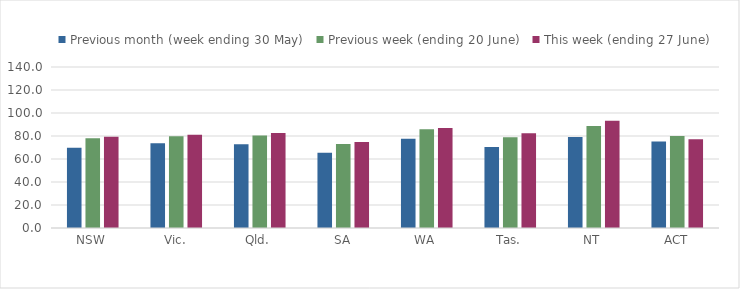
| Category | Previous month (week ending 30 May) | Previous week (ending 20 June) | This week (ending 27 June) |
|---|---|---|---|
| NSW | 69.873 | 77.946 | 79.283 |
| Vic. | 73.625 | 79.747 | 81.051 |
| Qld. | 72.76 | 80.413 | 82.523 |
| SA | 65.486 | 73.131 | 74.86 |
| WA | 77.51 | 85.819 | 87.059 |
| Tas. | 70.435 | 78.858 | 82.396 |
| NT | 79.21 | 88.617 | 93.172 |
| ACT | 75.195 | 80.021 | 77.228 |